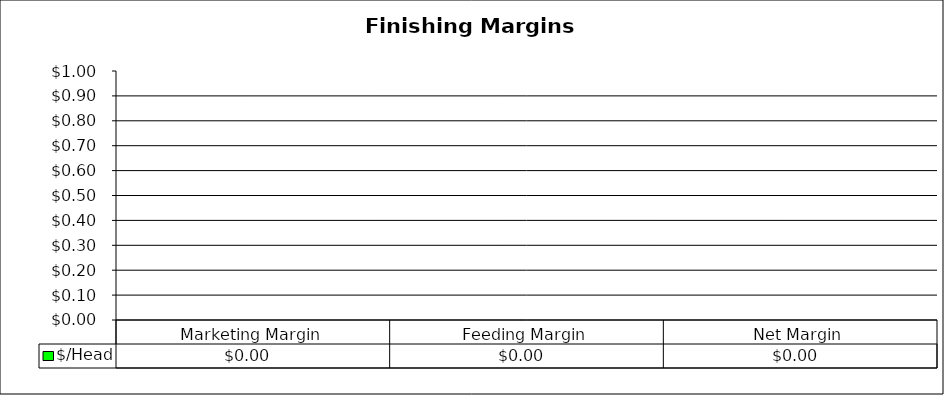
| Category | $/Head |
|---|---|
| Marketing Margin | 0 |
| Feeding Margin | 0 |
| Net Margin | 0 |